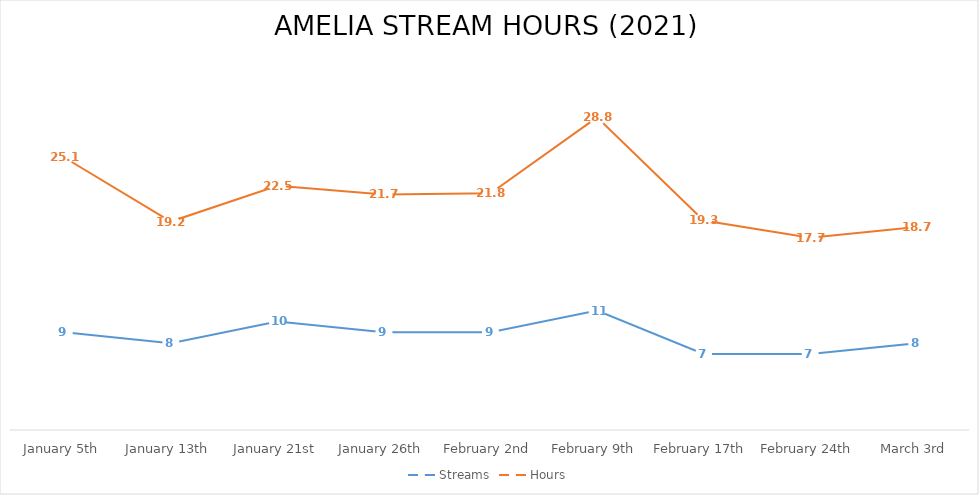
| Category | Streams | Hours |
|---|---|---|
| January 5th | 9 | 25.1 |
| January 13th | 8 | 19.2 |
| January 21st | 10 | 22.5 |
| January 26th | 9 | 21.7 |
| February 2nd | 9 | 21.8 |
| February 9th | 11 | 28.8 |
| February 17th | 7 | 19.3 |
| February 24th | 7 | 17.7 |
| March 3rd | 8 | 18.7 |